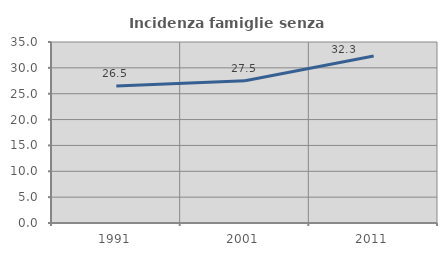
| Category | Incidenza famiglie senza nuclei |
|---|---|
| 1991.0 | 26.498 |
| 2001.0 | 27.512 |
| 2011.0 | 32.285 |